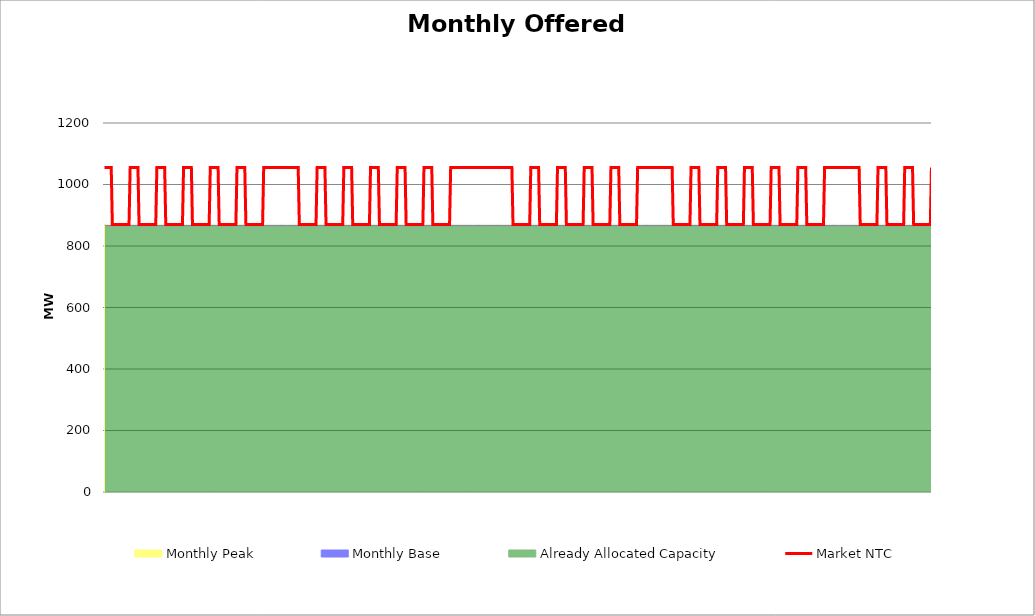
| Category | Market NTC |
|---|---|
| 0 | 1055 |
| 1 | 1055 |
| 2 | 1055 |
| 3 | 1055 |
| 4 | 1055 |
| 5 | 1055 |
| 6 | 1055 |
| 7 | 870 |
| 8 | 870 |
| 9 | 870 |
| 10 | 870 |
| 11 | 870 |
| 12 | 870 |
| 13 | 870 |
| 14 | 870 |
| 15 | 870 |
| 16 | 870 |
| 17 | 870 |
| 18 | 870 |
| 19 | 870 |
| 20 | 870 |
| 21 | 870 |
| 22 | 870 |
| 23 | 1055 |
| 24 | 1055 |
| 25 | 1055 |
| 26 | 1055 |
| 27 | 1055 |
| 28 | 1055 |
| 29 | 1055 |
| 30 | 1055 |
| 31 | 870 |
| 32 | 870 |
| 33 | 870 |
| 34 | 870 |
| 35 | 870 |
| 36 | 870 |
| 37 | 870 |
| 38 | 870 |
| 39 | 870 |
| 40 | 870 |
| 41 | 870 |
| 42 | 870 |
| 43 | 870 |
| 44 | 870 |
| 45 | 870 |
| 46 | 870 |
| 47 | 1055 |
| 48 | 1055 |
| 49 | 1055 |
| 50 | 1055 |
| 51 | 1055 |
| 52 | 1055 |
| 53 | 1055 |
| 54 | 1055 |
| 55 | 870 |
| 56 | 870 |
| 57 | 870 |
| 58 | 870 |
| 59 | 870 |
| 60 | 870 |
| 61 | 870 |
| 62 | 870 |
| 63 | 870 |
| 64 | 870 |
| 65 | 870 |
| 66 | 870 |
| 67 | 870 |
| 68 | 870 |
| 69 | 870 |
| 70 | 870 |
| 71 | 1055 |
| 72 | 1055 |
| 73 | 1055 |
| 74 | 1055 |
| 75 | 1055 |
| 76 | 1055 |
| 77 | 1055 |
| 78 | 1055 |
| 79 | 870 |
| 80 | 870 |
| 81 | 870 |
| 82 | 870 |
| 83 | 870 |
| 84 | 870 |
| 85 | 870 |
| 86 | 870 |
| 87 | 870 |
| 88 | 870 |
| 89 | 870 |
| 90 | 870 |
| 91 | 870 |
| 92 | 870 |
| 93 | 870 |
| 94 | 870 |
| 95 | 1055 |
| 96 | 1055 |
| 97 | 1055 |
| 98 | 1055 |
| 99 | 1055 |
| 100 | 1055 |
| 101 | 1055 |
| 102 | 1055 |
| 103 | 870 |
| 104 | 870 |
| 105 | 870 |
| 106 | 870 |
| 107 | 870 |
| 108 | 870 |
| 109 | 870 |
| 110 | 870 |
| 111 | 870 |
| 112 | 870 |
| 113 | 870 |
| 114 | 870 |
| 115 | 870 |
| 116 | 870 |
| 117 | 870 |
| 118 | 870 |
| 119 | 1055 |
| 120 | 1055 |
| 121 | 1055 |
| 122 | 1055 |
| 123 | 1055 |
| 124 | 1055 |
| 125 | 1055 |
| 126 | 1055 |
| 127 | 870 |
| 128 | 870 |
| 129 | 870 |
| 130 | 870 |
| 131 | 870 |
| 132 | 870 |
| 133 | 870 |
| 134 | 870 |
| 135 | 870 |
| 136 | 870 |
| 137 | 870 |
| 138 | 870 |
| 139 | 870 |
| 140 | 870 |
| 141 | 870 |
| 142 | 870 |
| 143 | 1055 |
| 144 | 1055 |
| 145 | 1055 |
| 146 | 1055 |
| 147 | 1055 |
| 148 | 1055 |
| 149 | 1055 |
| 150 | 1055 |
| 151 | 1055 |
| 152 | 1055 |
| 153 | 1055 |
| 154 | 1055 |
| 155 | 1055 |
| 156 | 1055 |
| 157 | 1055 |
| 158 | 1055 |
| 159 | 1055 |
| 160 | 1055 |
| 161 | 1055 |
| 162 | 1055 |
| 163 | 1055 |
| 164 | 1055 |
| 165 | 1055 |
| 166 | 1055 |
| 167 | 1055 |
| 168 | 1055 |
| 169 | 1055 |
| 170 | 1055 |
| 171 | 1055 |
| 172 | 1055 |
| 173 | 1055 |
| 174 | 1055 |
| 175 | 870 |
| 176 | 870 |
| 177 | 870 |
| 178 | 870 |
| 179 | 870 |
| 180 | 870 |
| 181 | 870 |
| 182 | 870 |
| 183 | 870 |
| 184 | 870 |
| 185 | 870 |
| 186 | 870 |
| 187 | 870 |
| 188 | 870 |
| 189 | 870 |
| 190 | 870 |
| 191 | 1055 |
| 192 | 1055 |
| 193 | 1055 |
| 194 | 1055 |
| 195 | 1055 |
| 196 | 1055 |
| 197 | 1055 |
| 198 | 1055 |
| 199 | 870 |
| 200 | 870 |
| 201 | 870 |
| 202 | 870 |
| 203 | 870 |
| 204 | 870 |
| 205 | 870 |
| 206 | 870 |
| 207 | 870 |
| 208 | 870 |
| 209 | 870 |
| 210 | 870 |
| 211 | 870 |
| 212 | 870 |
| 213 | 870 |
| 214 | 870 |
| 215 | 1055 |
| 216 | 1055 |
| 217 | 1055 |
| 218 | 1055 |
| 219 | 1055 |
| 220 | 1055 |
| 221 | 1055 |
| 222 | 1055 |
| 223 | 870 |
| 224 | 870 |
| 225 | 870 |
| 226 | 870 |
| 227 | 870 |
| 228 | 870 |
| 229 | 870 |
| 230 | 870 |
| 231 | 870 |
| 232 | 870 |
| 233 | 870 |
| 234 | 870 |
| 235 | 870 |
| 236 | 870 |
| 237 | 870 |
| 238 | 870 |
| 239 | 1055 |
| 240 | 1055 |
| 241 | 1055 |
| 242 | 1055 |
| 243 | 1055 |
| 244 | 1055 |
| 245 | 1055 |
| 246 | 1055 |
| 247 | 870 |
| 248 | 870 |
| 249 | 870 |
| 250 | 870 |
| 251 | 870 |
| 252 | 870 |
| 253 | 870 |
| 254 | 870 |
| 255 | 870 |
| 256 | 870 |
| 257 | 870 |
| 258 | 870 |
| 259 | 870 |
| 260 | 870 |
| 261 | 870 |
| 262 | 870 |
| 263 | 1055 |
| 264 | 1055 |
| 265 | 1055 |
| 266 | 1055 |
| 267 | 1055 |
| 268 | 1055 |
| 269 | 1055 |
| 270 | 1055 |
| 271 | 870 |
| 272 | 870 |
| 273 | 870 |
| 274 | 870 |
| 275 | 870 |
| 276 | 870 |
| 277 | 870 |
| 278 | 870 |
| 279 | 870 |
| 280 | 870 |
| 281 | 870 |
| 282 | 870 |
| 283 | 870 |
| 284 | 870 |
| 285 | 870 |
| 286 | 870 |
| 287 | 1055 |
| 288 | 1055 |
| 289 | 1055 |
| 290 | 1055 |
| 291 | 1055 |
| 292 | 1055 |
| 293 | 1055 |
| 294 | 1055 |
| 295 | 870 |
| 296 | 870 |
| 297 | 870 |
| 298 | 870 |
| 299 | 870 |
| 300 | 870 |
| 301 | 870 |
| 302 | 870 |
| 303 | 870 |
| 304 | 870 |
| 305 | 870 |
| 306 | 870 |
| 307 | 870 |
| 308 | 870 |
| 309 | 870 |
| 310 | 870 |
| 311 | 1055 |
| 312 | 1055 |
| 313 | 1055 |
| 314 | 1055 |
| 315 | 1055 |
| 316 | 1055 |
| 317 | 1055 |
| 318 | 1055 |
| 319 | 1055 |
| 320 | 1055 |
| 321 | 1055 |
| 322 | 1055 |
| 323 | 1055 |
| 324 | 1055 |
| 325 | 1055 |
| 326 | 1055 |
| 327 | 1055 |
| 328 | 1055 |
| 329 | 1055 |
| 330 | 1055 |
| 331 | 1055 |
| 332 | 1055 |
| 333 | 1055 |
| 334 | 1055 |
| 335 | 1055 |
| 336 | 1055 |
| 337 | 1055 |
| 338 | 1055 |
| 339 | 1055 |
| 340 | 1055 |
| 341 | 1055 |
| 342 | 1055 |
| 343 | 1055 |
| 344 | 1055 |
| 345 | 1055 |
| 346 | 1055 |
| 347 | 1055 |
| 348 | 1055 |
| 349 | 1055 |
| 350 | 1055 |
| 351 | 1055 |
| 352 | 1055 |
| 353 | 1055 |
| 354 | 1055 |
| 355 | 1055 |
| 356 | 1055 |
| 357 | 1055 |
| 358 | 1055 |
| 359 | 1055 |
| 360 | 1055 |
| 361 | 1055 |
| 362 | 1055 |
| 363 | 1055 |
| 364 | 1055 |
| 365 | 1055 |
| 366 | 1055 |
| 367 | 870 |
| 368 | 870 |
| 369 | 870 |
| 370 | 870 |
| 371 | 870 |
| 372 | 870 |
| 373 | 870 |
| 374 | 870 |
| 375 | 870 |
| 376 | 870 |
| 377 | 870 |
| 378 | 870 |
| 379 | 870 |
| 380 | 870 |
| 381 | 870 |
| 382 | 870 |
| 383 | 1055 |
| 384 | 1055 |
| 385 | 1055 |
| 386 | 1055 |
| 387 | 1055 |
| 388 | 1055 |
| 389 | 1055 |
| 390 | 1055 |
| 391 | 870 |
| 392 | 870 |
| 393 | 870 |
| 394 | 870 |
| 395 | 870 |
| 396 | 870 |
| 397 | 870 |
| 398 | 870 |
| 399 | 870 |
| 400 | 870 |
| 401 | 870 |
| 402 | 870 |
| 403 | 870 |
| 404 | 870 |
| 405 | 870 |
| 406 | 870 |
| 407 | 1055 |
| 408 | 1055 |
| 409 | 1055 |
| 410 | 1055 |
| 411 | 1055 |
| 412 | 1055 |
| 413 | 1055 |
| 414 | 1055 |
| 415 | 870 |
| 416 | 870 |
| 417 | 870 |
| 418 | 870 |
| 419 | 870 |
| 420 | 870 |
| 421 | 870 |
| 422 | 870 |
| 423 | 870 |
| 424 | 870 |
| 425 | 870 |
| 426 | 870 |
| 427 | 870 |
| 428 | 870 |
| 429 | 870 |
| 430 | 870 |
| 431 | 1055 |
| 432 | 1055 |
| 433 | 1055 |
| 434 | 1055 |
| 435 | 1055 |
| 436 | 1055 |
| 437 | 1055 |
| 438 | 1055 |
| 439 | 870 |
| 440 | 870 |
| 441 | 870 |
| 442 | 870 |
| 443 | 870 |
| 444 | 870 |
| 445 | 870 |
| 446 | 870 |
| 447 | 870 |
| 448 | 870 |
| 449 | 870 |
| 450 | 870 |
| 451 | 870 |
| 452 | 870 |
| 453 | 870 |
| 454 | 870 |
| 455 | 1055 |
| 456 | 1055 |
| 457 | 1055 |
| 458 | 1055 |
| 459 | 1055 |
| 460 | 1055 |
| 461 | 1055 |
| 462 | 1055 |
| 463 | 870 |
| 464 | 870 |
| 465 | 870 |
| 466 | 870 |
| 467 | 870 |
| 468 | 870 |
| 469 | 870 |
| 470 | 870 |
| 471 | 870 |
| 472 | 870 |
| 473 | 870 |
| 474 | 870 |
| 475 | 870 |
| 476 | 870 |
| 477 | 870 |
| 478 | 870 |
| 479 | 1055 |
| 480 | 1055 |
| 481 | 1055 |
| 482 | 1055 |
| 483 | 1055 |
| 484 | 1055 |
| 485 | 1055 |
| 486 | 1055 |
| 487 | 1055 |
| 488 | 1055 |
| 489 | 1055 |
| 490 | 1055 |
| 491 | 1055 |
| 492 | 1055 |
| 493 | 1055 |
| 494 | 1055 |
| 495 | 1055 |
| 496 | 1055 |
| 497 | 1055 |
| 498 | 1055 |
| 499 | 1055 |
| 500 | 1055 |
| 501 | 1055 |
| 502 | 1055 |
| 503 | 1055 |
| 504 | 1055 |
| 505 | 1055 |
| 506 | 1055 |
| 507 | 1055 |
| 508 | 1055 |
| 509 | 1055 |
| 510 | 1055 |
| 511 | 870 |
| 512 | 870 |
| 513 | 870 |
| 514 | 870 |
| 515 | 870 |
| 516 | 870 |
| 517 | 870 |
| 518 | 870 |
| 519 | 870 |
| 520 | 870 |
| 521 | 870 |
| 522 | 870 |
| 523 | 870 |
| 524 | 870 |
| 525 | 870 |
| 526 | 870 |
| 527 | 1055 |
| 528 | 1055 |
| 529 | 1055 |
| 530 | 1055 |
| 531 | 1055 |
| 532 | 1055 |
| 533 | 1055 |
| 534 | 1055 |
| 535 | 870 |
| 536 | 870 |
| 537 | 870 |
| 538 | 870 |
| 539 | 870 |
| 540 | 870 |
| 541 | 870 |
| 542 | 870 |
| 543 | 870 |
| 544 | 870 |
| 545 | 870 |
| 546 | 870 |
| 547 | 870 |
| 548 | 870 |
| 549 | 870 |
| 550 | 870 |
| 551 | 1055 |
| 552 | 1055 |
| 553 | 1055 |
| 554 | 1055 |
| 555 | 1055 |
| 556 | 1055 |
| 557 | 1055 |
| 558 | 1055 |
| 559 | 870 |
| 560 | 870 |
| 561 | 870 |
| 562 | 870 |
| 563 | 870 |
| 564 | 870 |
| 565 | 870 |
| 566 | 870 |
| 567 | 870 |
| 568 | 870 |
| 569 | 870 |
| 570 | 870 |
| 571 | 870 |
| 572 | 870 |
| 573 | 870 |
| 574 | 870 |
| 575 | 1055 |
| 576 | 1055 |
| 577 | 1055 |
| 578 | 1055 |
| 579 | 1055 |
| 580 | 1055 |
| 581 | 1055 |
| 582 | 1055 |
| 583 | 870 |
| 584 | 870 |
| 585 | 870 |
| 586 | 870 |
| 587 | 870 |
| 588 | 870 |
| 589 | 870 |
| 590 | 870 |
| 591 | 870 |
| 592 | 870 |
| 593 | 870 |
| 594 | 870 |
| 595 | 870 |
| 596 | 870 |
| 597 | 870 |
| 598 | 870 |
| 599 | 1055 |
| 600 | 1055 |
| 601 | 1055 |
| 602 | 1055 |
| 603 | 1055 |
| 604 | 1055 |
| 605 | 1055 |
| 606 | 1055 |
| 607 | 870 |
| 608 | 870 |
| 609 | 870 |
| 610 | 870 |
| 611 | 870 |
| 612 | 870 |
| 613 | 870 |
| 614 | 870 |
| 615 | 870 |
| 616 | 870 |
| 617 | 870 |
| 618 | 870 |
| 619 | 870 |
| 620 | 870 |
| 621 | 870 |
| 622 | 870 |
| 623 | 1055 |
| 624 | 1055 |
| 625 | 1055 |
| 626 | 1055 |
| 627 | 1055 |
| 628 | 1055 |
| 629 | 1055 |
| 630 | 1055 |
| 631 | 870 |
| 632 | 870 |
| 633 | 870 |
| 634 | 870 |
| 635 | 870 |
| 636 | 870 |
| 637 | 870 |
| 638 | 870 |
| 639 | 870 |
| 640 | 870 |
| 641 | 870 |
| 642 | 870 |
| 643 | 870 |
| 644 | 870 |
| 645 | 870 |
| 646 | 870 |
| 647 | 1055 |
| 648 | 1055 |
| 649 | 1055 |
| 650 | 1055 |
| 651 | 1055 |
| 652 | 1055 |
| 653 | 1055 |
| 654 | 1055 |
| 655 | 1055 |
| 656 | 1055 |
| 657 | 1055 |
| 658 | 1055 |
| 659 | 1055 |
| 660 | 1055 |
| 661 | 1055 |
| 662 | 1055 |
| 663 | 1055 |
| 664 | 1055 |
| 665 | 1055 |
| 666 | 1055 |
| 667 | 1055 |
| 668 | 1055 |
| 669 | 1055 |
| 670 | 1055 |
| 671 | 1055 |
| 672 | 1055 |
| 673 | 1055 |
| 674 | 1055 |
| 675 | 1055 |
| 676 | 1055 |
| 677 | 1055 |
| 678 | 1055 |
| 679 | 870 |
| 680 | 870 |
| 681 | 870 |
| 682 | 870 |
| 683 | 870 |
| 684 | 870 |
| 685 | 870 |
| 686 | 870 |
| 687 | 870 |
| 688 | 870 |
| 689 | 870 |
| 690 | 870 |
| 691 | 870 |
| 692 | 870 |
| 693 | 870 |
| 694 | 870 |
| 695 | 1055 |
| 696 | 1055 |
| 697 | 1055 |
| 698 | 1055 |
| 699 | 1055 |
| 700 | 1055 |
| 701 | 1055 |
| 702 | 1055 |
| 703 | 870 |
| 704 | 870 |
| 705 | 870 |
| 706 | 870 |
| 707 | 870 |
| 708 | 870 |
| 709 | 870 |
| 710 | 870 |
| 711 | 870 |
| 712 | 870 |
| 713 | 870 |
| 714 | 870 |
| 715 | 870 |
| 716 | 870 |
| 717 | 870 |
| 718 | 870 |
| 719 | 1055 |
| 720 | 1055 |
| 721 | 1055 |
| 722 | 1055 |
| 723 | 1055 |
| 724 | 1055 |
| 725 | 1055 |
| 726 | 1055 |
| 727 | 870 |
| 728 | 870 |
| 729 | 870 |
| 730 | 870 |
| 731 | 870 |
| 732 | 870 |
| 733 | 870 |
| 734 | 870 |
| 735 | 870 |
| 736 | 870 |
| 737 | 870 |
| 738 | 870 |
| 739 | 870 |
| 740 | 870 |
| 741 | 870 |
| 742 | 870 |
| 743 | 1055 |